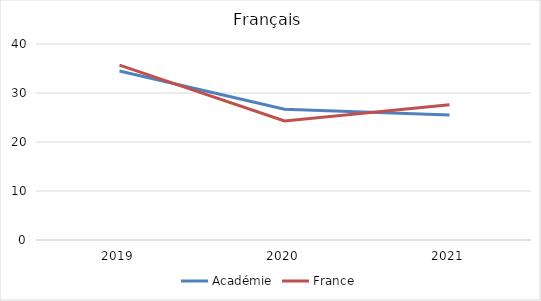
| Category | Académie | France |
|---|---|---|
| 2019.0 | 34.5 | 35.7 |
| 2020.0 | 26.7 | 24.3 |
| 2021.0 | 25.5 | 27.6 |